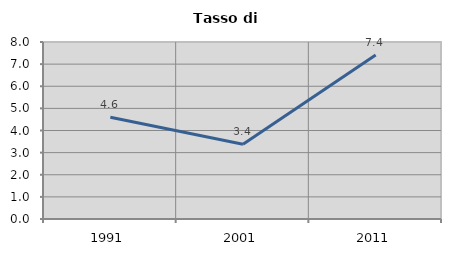
| Category | Tasso di disoccupazione   |
|---|---|
| 1991.0 | 4.599 |
| 2001.0 | 3.379 |
| 2011.0 | 7.417 |